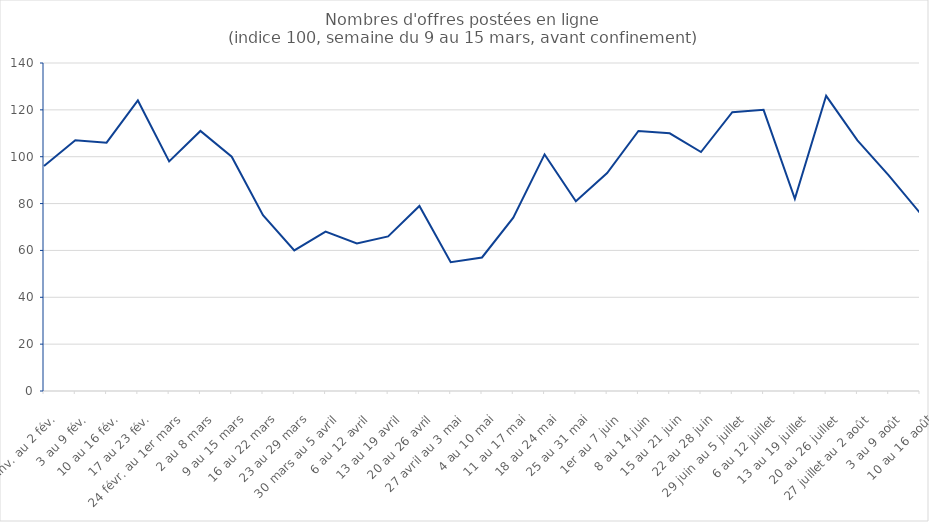
| Category | Series 0 | Series 1 |
|---|---|---|
| 27 janv. au 2 fév. | 96 |  |
| 3 au 9 fév. | 107 |  |
| 10 au 16 fév. | 106 |  |
| 17 au 23 fév. | 124 |  |
| 24 févr. au 1er mars | 98 |  |
| 2 au 8 mars | 111 |  |
| 9 au 15 mars | 100 |  |
| 16 au 22 mars | 75 |  |
| 23 au 29 mars | 60 |  |
| 30 mars au 5 avril | 68 |  |
| 6 au 12 avril | 63 |  |
| 13 au 19 avril | 66 |  |
| 20 au 26 avril | 79 |  |
| 27 avril au 3 mai | 55 |  |
| 4 au 10 mai | 57 |  |
| 11 au 17 mai | 74 |  |
| 18 au 24 mai | 101 |  |
| 25 au 31 mai | 81 |  |
| 1er au 7 juin | 93 |  |
| 8 au 14 juin | 111 |  |
| 15 au 21 juin | 110 |  |
| 22 au 28 juin | 102 |  |
| 29 juin au 5 juillet | 119 |  |
| 6 au 12 juillet | 120 |  |
| 13 au 19 juillet | 82 |  |
| 20 au 26 juillet | 126 |  |
| 27 juillet au 2 août | 107 |  |
| 3 au 9 août | 92 |  |
| 10 au 16 août | 76 |  |